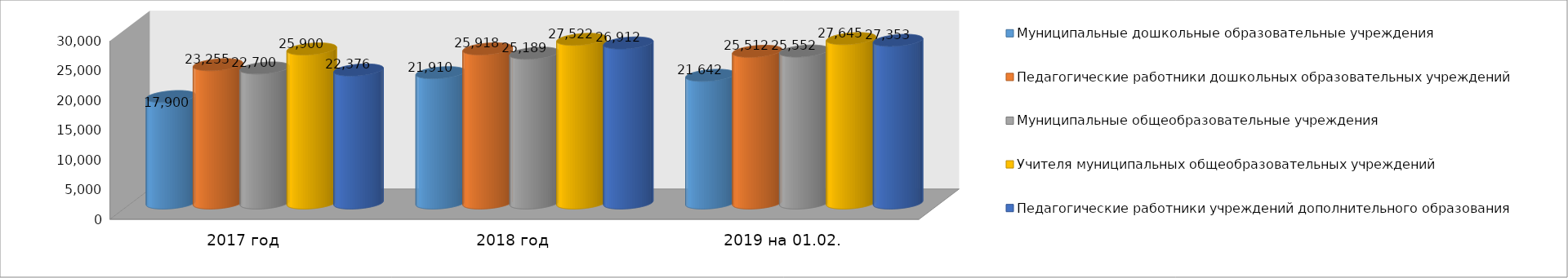
| Category | Муниципальные дошкольные образовательные учреждения | Педагогические работники дошкольных образовательных учреждений | Муниципальные общеобразовательные учреждения | Учителя муниципальных общеобразовательных учреждений | Педагогические работники учреждений дополнительного образования |
|---|---|---|---|---|---|
| 2017 год | 17900 | 23255 | 22700 | 25900 | 22376 |
| 2018 год | 21910 | 25918 | 25189 | 27522 | 26912 |
| 2019 на 01.02. | 21469 | 25512 | 25552 | 27645 | 27353 |